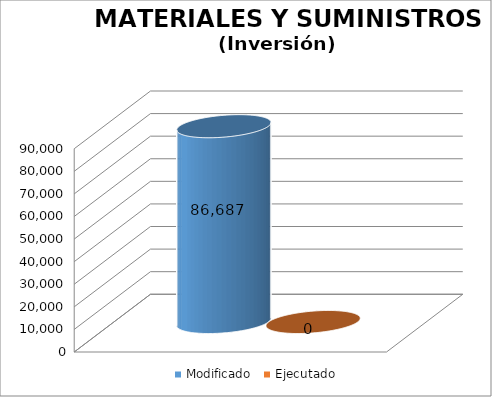
| Category | Modificado | Ejecutado |
|---|---|---|
| 0 | 86687 | 0 |